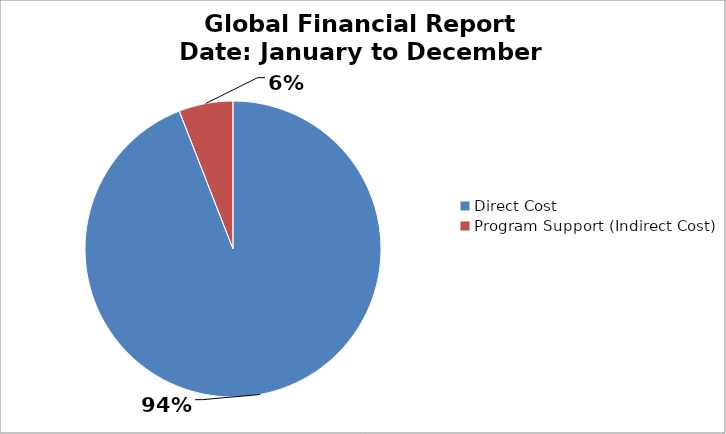
| Category | Total Expenses |
|---|---|
| Direct Cost | 91106.03 |
| Program Support (Indirect Cost) | 5728.78 |